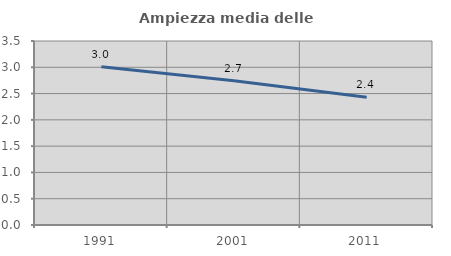
| Category | Ampiezza media delle famiglie |
|---|---|
| 1991.0 | 3.009 |
| 2001.0 | 2.745 |
| 2011.0 | 2.432 |